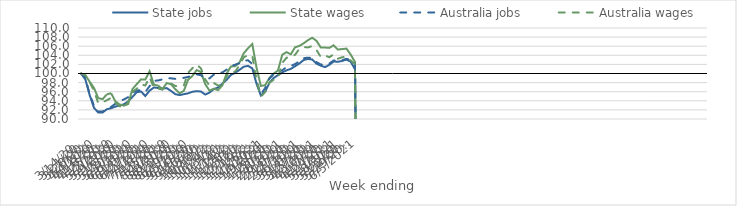
| Category | State jobs | State wages | Australia jobs | Australia wages |
|---|---|---|---|---|
| 14/03/2020 | 100 | 100 | 100 | 100 |
| 21/03/2020 | 98.646 | 99.613 | 98.972 | 99.605 |
| 28/03/2020 | 95.231 | 98.178 | 95.467 | 98.106 |
| 04/04/2020 | 92.462 | 96.841 | 92.921 | 96.238 |
| 11/04/2020 | 91.413 | 94.585 | 91.648 | 93.491 |
| 18/04/2020 | 91.415 | 94.367 | 91.631 | 93.694 |
| 25/04/2020 | 92.14 | 95.41 | 92.161 | 94.113 |
| 02/05/2020 | 92.36 | 95.674 | 92.658 | 94.66 |
| 09/05/2020 | 92.73 | 93.883 | 93.343 | 93.583 |
| 16/05/2020 | 92.972 | 93.184 | 93.936 | 92.817 |
| 23/05/2020 | 93.23 | 92.933 | 94.294 | 92.471 |
| 30/05/2020 | 93.898 | 93.299 | 94.802 | 93.799 |
| 06/06/2020 | 94.866 | 96.589 | 95.786 | 95.975 |
| 13/06/2020 | 95.896 | 97.657 | 96.286 | 96.648 |
| 20/06/2020 | 96.028 | 98.71 | 96.302 | 97.605 |
| 27/06/2020 | 95.054 | 98.685 | 95.914 | 97.364 |
| 04/07/2020 | 96.226 | 100.498 | 97.234 | 99.209 |
| 11/07/2020 | 96.934 | 97.531 | 98.377 | 96.842 |
| 18/07/2020 | 96.807 | 97.337 | 98.483 | 96.672 |
| 25/07/2020 | 96.722 | 96.572 | 98.707 | 96.464 |
| 01/08/2020 | 96.791 | 97.893 | 98.939 | 97.319 |
| 08/08/2020 | 96.17 | 97.655 | 98.937 | 97.774 |
| 15/08/2020 | 95.461 | 96.564 | 98.822 | 97.284 |
| 22/08/2020 | 95.25 | 95.646 | 98.911 | 97.15 |
| 29/08/2020 | 95.455 | 96.198 | 99.048 | 97.377 |
| 05/09/2020 | 95.645 | 98.628 | 99.236 | 100.159 |
| 12/09/2020 | 95.986 | 99.471 | 99.656 | 101.158 |
| 19/09/2020 | 96.119 | 100.758 | 99.825 | 101.963 |
| 26/09/2020 | 96.039 | 100.323 | 99.625 | 101.122 |
| 03/10/2020 | 95.375 | 97.657 | 98.824 | 98.703 |
| 10/10/2020 | 95.804 | 96.231 | 98.93 | 97.286 |
| 17/10/2020 | 96.568 | 96.666 | 99.758 | 97.926 |
| 24/10/2020 | 96.934 | 96.349 | 100.051 | 97.346 |
| 31/10/2020 | 97.744 | 97.413 | 100.234 | 97.513 |
| 07/11/2020 | 98.619 | 99.975 | 100.843 | 99.39 |
| 14/11/2020 | 99.685 | 101.532 | 101.614 | 100.362 |
| 21/11/2020 | 100.153 | 101.607 | 101.941 | 100.423 |
| 28/11/2020 | 100.784 | 102.406 | 102.262 | 101.777 |
| 05/12/2020 | 101.488 | 104.446 | 102.828 | 103.567 |
| 12/12/2020 | 101.676 | 105.545 | 102.902 | 104.028 |
| 19/12/2020 | 101.136 | 106.504 | 102.101 | 103.902 |
| 26/12/2020 | 97.71 | 101.227 | 98.307 | 98.441 |
| 02/01/2021 | 95.183 | 97.272 | 95.41 | 94.903 |
| 09/01/2021 | 96.006 | 97.424 | 96.79 | 95.912 |
| 16/01/2021 | 97.94 | 99.021 | 98.893 | 97.958 |
| 23/01/2021 | 99.028 | 99.964 | 99.862 | 98.634 |
| 30/01/2021 | 99.634 | 100.658 | 100.346 | 98.978 |
| 06/02/2021 | 100.24 | 104.121 | 100.698 | 102.329 |
| 13/02/2021 | 100.695 | 104.702 | 101.406 | 103.465 |
| 20/02/2021 | 101.018 | 104.218 | 101.644 | 103.55 |
| 27/02/2021 | 101.596 | 105.771 | 102.078 | 104.122 |
| 06/03/2021 | 102.203 | 106.054 | 102.697 | 105.405 |
| 13/03/2021 | 102.959 | 106.633 | 103.369 | 105.802 |
| 20/03/2021 | 103.204 | 107.322 | 103.483 | 105.731 |
| 27/03/2021 | 103.07 | 107.858 | 103.4 | 106.023 |
| 03/04/2021 | 102.178 | 107.185 | 102.51 | 105.184 |
| 10/04/2021 | 101.718 | 105.729 | 101.979 | 103.615 |
| 17/04/2021 | 101.408 | 105.712 | 101.926 | 103.956 |
| 24/04/2021 | 101.9 | 105.628 | 102.186 | 103.563 |
| 01/05/2021 | 102.637 | 106.207 | 102.848 | 104.217 |
| 08/05/2021 | 102.575 | 105.251 | 102.834 | 103.251 |
| 15/05/2021 | 102.762 | 105.375 | 102.922 | 103.573 |
| 22/05/2021 | 103.058 | 105.476 | 103.224 | 103.677 |
| 29/05/2021 | 102.601 | 104.142 | 102.941 | 102.856 |
| 05/06/2021 | 100.931 | 102.547 | 102.252 | 102.059 |